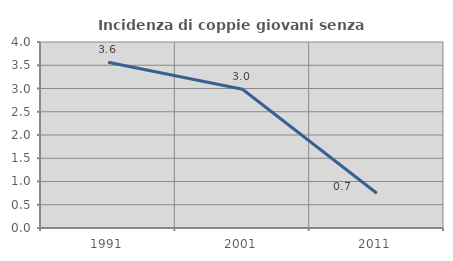
| Category | Incidenza di coppie giovani senza figli |
|---|---|
| 1991.0 | 3.563 |
| 2001.0 | 2.985 |
| 2011.0 | 0.746 |